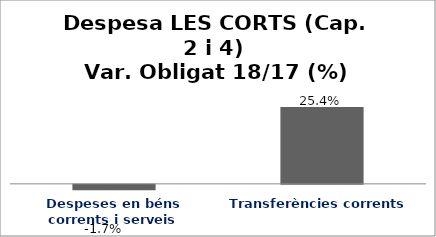
| Category | Series 0 |
|---|---|
| Despeses en béns corrents i serveis | -0.017 |
| Transferències corrents | 0.254 |